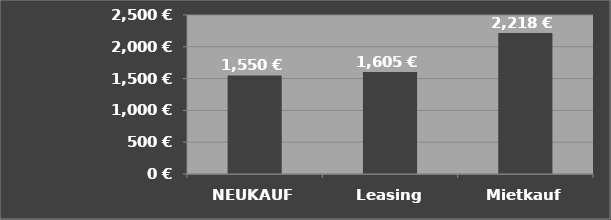
| Category | Monatsrate
(umgerechnet) |
|---|---|
| NEUKAUF | 1550.167 |
| Leasing | 1604.898 |
| Mietkauf | 2217.701 |